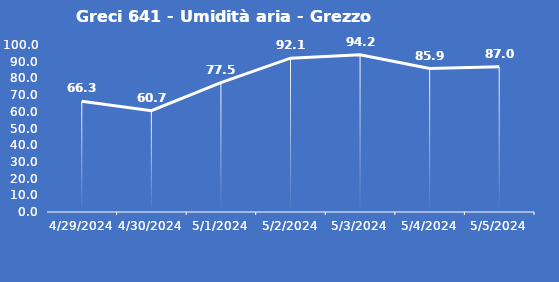
| Category | Greci 641 - Umidità aria - Grezzo (%) |
|---|---|
| 4/29/24 | 66.3 |
| 4/30/24 | 60.7 |
| 5/1/24 | 77.5 |
| 5/2/24 | 92.1 |
| 5/3/24 | 94.2 |
| 5/4/24 | 85.9 |
| 5/5/24 | 87 |